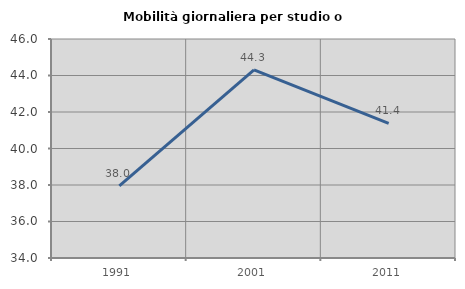
| Category | Mobilità giornaliera per studio o lavoro |
|---|---|
| 1991.0 | 37.952 |
| 2001.0 | 44.304 |
| 2011.0 | 41.379 |